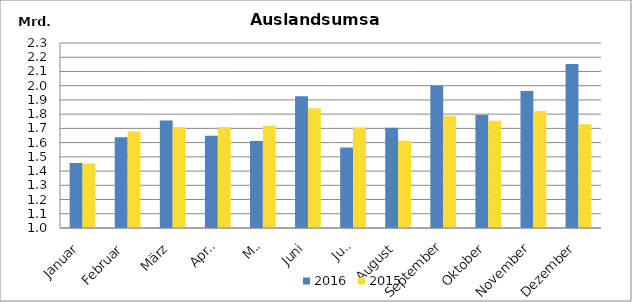
| Category | 2016 | 2015 |
|---|---|---|
| Januar | 1456349.954 | 1452524.112 |
| Februar | 1636938.326 | 1677471.412 |
| März | 1754615.542 | 1707582.574 |
| April | 1647515.025 | 1710381.153 |
| Mai | 1611247.508 | 1719353.173 |
| Juni | 1925267.76 | 1841987.728 |
| Juli | 1566379.804 | 1706838.796 |
| August | 1704945.528 | 1612330.593 |
| September | 1999702.334 | 1788762.702 |
| Oktober | 1793767.005 | 1754334.717 |
| November | 1963427.033 | 1822272.396 |
| Dezember | 2151951.857 | 1728455.913 |